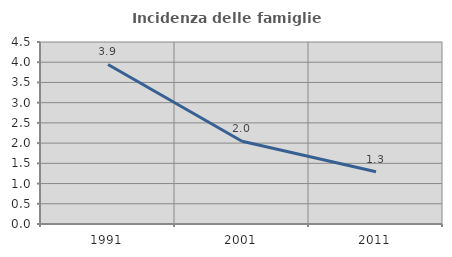
| Category | Incidenza delle famiglie numerose |
|---|---|
| 1991.0 | 3.944 |
| 2001.0 | 2.047 |
| 2011.0 | 1.291 |